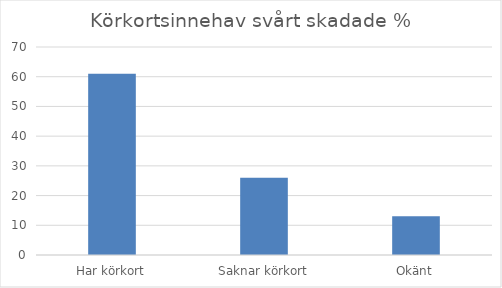
| Category | Andel |
|---|---|
| Har körkort | 61 |
| Saknar körkort | 26 |
| Okänt | 13 |